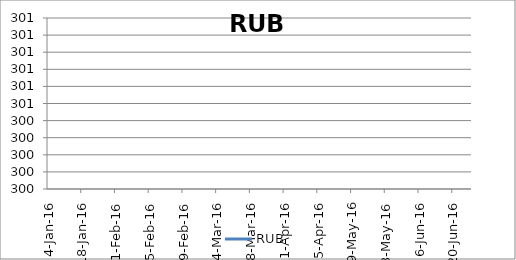
| Category | RUB |
|---|---|
| 2016-01-04 | 0 |
| 2016-01-11 | 0 |
| 2016-01-18 | 0 |
| 2016-01-25 | 0 |
| 2016-02-01 | 0 |
| 2016-02-08 | 0 |
| 2016-02-15 | 0 |
| 2016-02-22 | 0 |
| 2016-02-29 | 0 |
| 2016-03-07 | 0 |
| 2016-03-14 | 0 |
| 2016-03-21 | 0 |
| 2016-03-28 | 0 |
| 2016-04-04 | 0 |
| 2016-04-11 | 0 |
| 2016-04-18 | 0 |
| 2016-04-25 | 0 |
| 2016-05-02 | 0 |
| 2016-05-09 | 0 |
| 2016-05-16 | 0 |
| 2016-05-23 | 0 |
| 2016-05-30 | 0 |
| 2016-06-06 | 0 |
| 2016-06-13 | 0 |
| 2016-06-20 | 0 |
| 2016-06-27 | 0 |